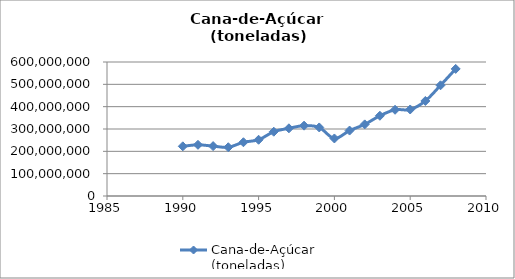
| Category | Cana-de-Açúcar 
(toneladas) |
|---|---|
| 1990.0 | 222429160 |
| 1991.0 | 229222243 |
| 1992.0 | 223356251 |
| 1993.0 | 218336005 |
| 1994.0 | 240712907 |
| 1995.0 | 251827212 |
| 1996.0 | 287808142 |
| 1997.0 | 303057415 |
| 1998.0 | 314922522 |
| 1999.0 | 306965623 |
| 2000.0 | 257622017 |
| 2001.0 | 293050543 |
| 2002.0 | 320650076 |
| 2003.0 | 359315559 |
| 2004.0 | 386090117.49 |
| 2005.0 | 387441876 |
| 2006.0 | 425535761 |
| 2007.0 | 495723279 |
| 2008.0 | 569062629 |